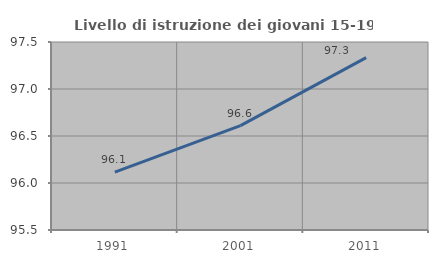
| Category | Livello di istruzione dei giovani 15-19 anni |
|---|---|
| 1991.0 | 96.117 |
| 2001.0 | 96.61 |
| 2011.0 | 97.333 |